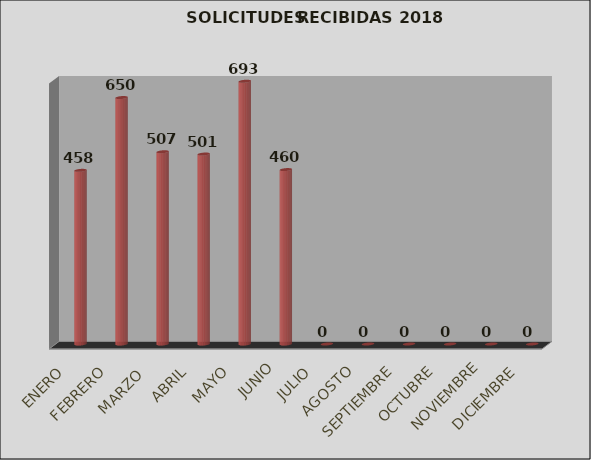
| Category | Series 0 | Series 1 |
|---|---|---|
| ENERO |  | 458 |
| FEBRERO |  | 650 |
| MARZO  |  | 507 |
| ABRIL |  | 501 |
| MAYO |  | 693 |
| JUNIO |  | 460 |
| JULIO |  | 0 |
| AGOSTO |  | 0 |
| SEPTIEMBRE |  | 0 |
| OCTUBRE |  | 0 |
| NOVIEMBRE |  | 0 |
| DICIEMBRE |  | 0 |